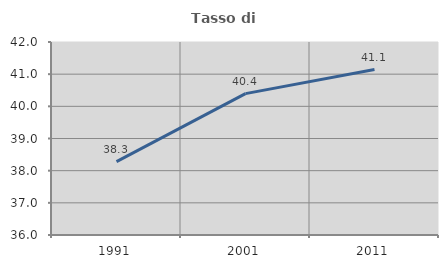
| Category | Tasso di occupazione   |
|---|---|
| 1991.0 | 38.28 |
| 2001.0 | 40.395 |
| 2011.0 | 41.144 |